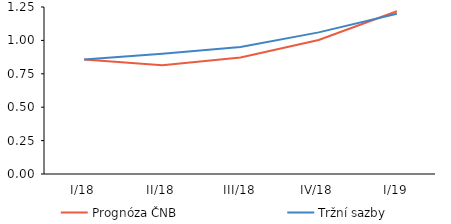
| Category | Prognóza ČNB | Tržní sazby |
|---|---|---|
| I/18 | 0.857 | 0.857 |
| II/18 | 0.814 | 0.9 |
| III/18 | 0.871 | 0.95 |
| IV/18 | 1.003 | 1.06 |
| I/19 | 1.219 | 1.2 |